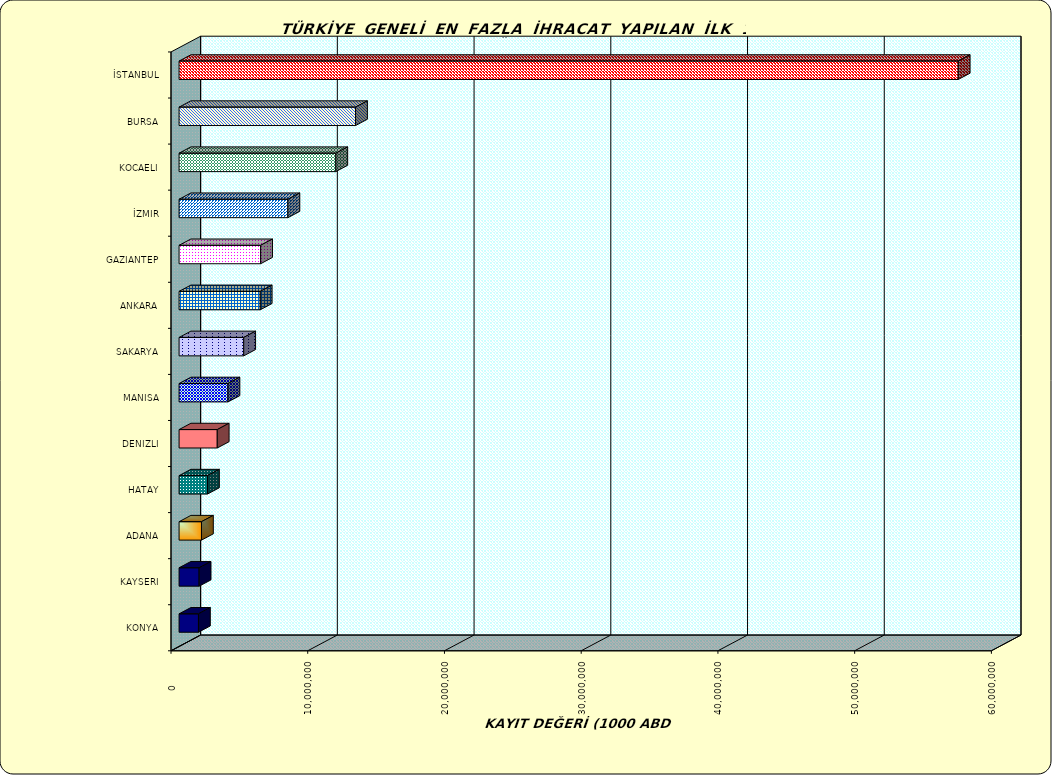
| Category | Series 0 |
|---|---|
| İSTANBUL | 56984704.526 |
| BURSA | 12907021.185 |
| KOCAELI | 11463902.811 |
| İZMIR | 7960559.308 |
| GAZIANTEP | 5964887.139 |
| ANKARA | 5936066.774 |
| SAKARYA | 4728206.318 |
| MANISA | 3576205.53 |
| DENIZLI | 2792090.709 |
| HATAY | 2078350.425 |
| ADANA | 1638228.247 |
| KAYSERI | 1466401.074 |
| KONYA | 1417687.257 |